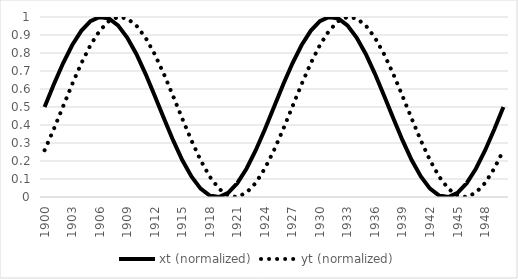
| Category | xt (normalized) | yt (normalized) |
|---|---|---|
| 1900-01-01 | 0.5 | 0.26 |
| 1901-01-01 | 0.625 | 0.377 |
| 1902-01-01 | 0.741 | 0.501 |
| 1903-01-01 | 0.843 | 0.626 |
| 1904-01-01 | 0.923 | 0.742 |
| 1905-01-01 | 0.976 | 0.844 |
| 1906-01-01 | 1 | 0.924 |
| 1907-01-01 | 0.992 | 0.977 |
| 1908-01-01 | 0.953 | 1 |
| 1909-01-01 | 0.886 | 0.992 |
| 1910-01-01 | 0.794 | 0.953 |
| 1911-01-01 | 0.684 | 0.885 |
| 1912-01-01 | 0.563 | 0.793 |
| 1913-01-01 | 0.437 | 0.683 |
| 1914-01-01 | 0.316 | 0.561 |
| 1915-01-01 | 0.206 | 0.436 |
| 1916-01-01 | 0.114 | 0.314 |
| 1917-01-01 | 0.047 | 0.204 |
| 1918-01-01 | 0.008 | 0.113 |
| 1919-01-01 | 0 | 0.046 |
| 1920-01-01 | 0.024 | 0.008 |
| 1921-01-01 | 0.077 | 0 |
| 1922-01-01 | 0.157 | 0.024 |
| 1923-01-01 | 0.259 | 0.078 |
| 1924-01-01 | 0.375 | 0.158 |
| 1925-01-01 | 0.5 | 0.26 |
| 1926-01-01 | 0.625 | 0.377 |
| 1927-01-01 | 0.741 | 0.501 |
| 1928-01-01 | 0.843 | 0.626 |
| 1929-01-01 | 0.923 | 0.742 |
| 1930-01-01 | 0.976 | 0.844 |
| 1931-01-01 | 1 | 0.924 |
| 1932-01-01 | 0.992 | 0.977 |
| 1933-01-01 | 0.953 | 1 |
| 1934-01-01 | 0.886 | 0.992 |
| 1935-01-01 | 0.794 | 0.953 |
| 1936-01-01 | 0.684 | 0.885 |
| 1937-01-01 | 0.563 | 0.793 |
| 1938-01-01 | 0.437 | 0.683 |
| 1939-01-01 | 0.316 | 0.561 |
| 1940-01-01 | 0.206 | 0.436 |
| 1941-01-01 | 0.114 | 0.314 |
| 1942-01-01 | 0.047 | 0.204 |
| 1943-01-01 | 0.008 | 0.113 |
| 1944-01-01 | 0 | 0.046 |
| 1945-01-01 | 0.024 | 0.008 |
| 1946-01-01 | 0.077 | 0 |
| 1947-01-01 | 0.157 | 0.024 |
| 1948-01-01 | 0.259 | 0.078 |
| 1949-01-01 | 0.375 | 0.158 |
| 1950-01-01 | 0.5 | 0.26 |